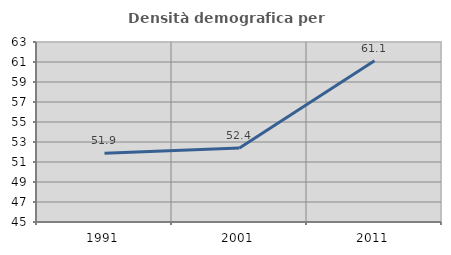
| Category | Densità demografica |
|---|---|
| 1991.0 | 51.885 |
| 2001.0 | 52.392 |
| 2011.0 | 61.129 |